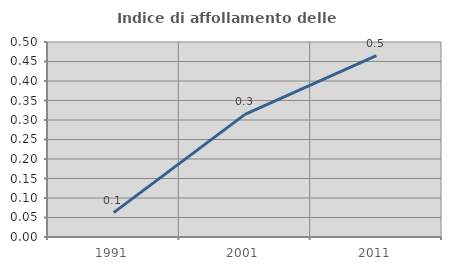
| Category | Indice di affollamento delle abitazioni  |
|---|---|
| 1991.0 | 0.062 |
| 2001.0 | 0.314 |
| 2011.0 | 0.465 |